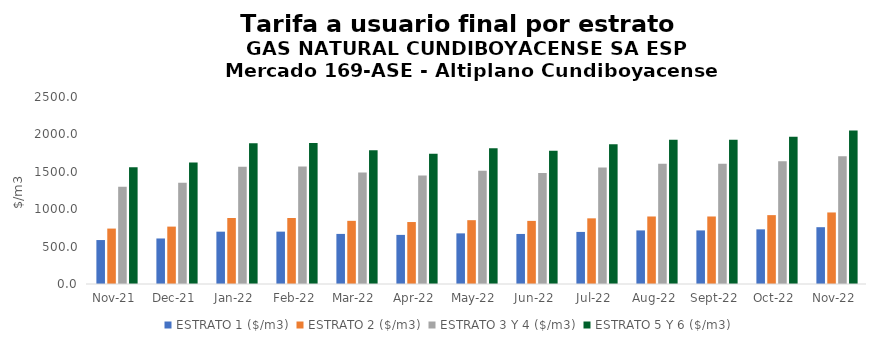
| Category | ESTRATO 1 ($/m3) | ESTRATO 2 ($/m3) | ESTRATO 3 Y 4 ($/m3) | ESTRATO 5 Y 6 ($/m3) |
|---|---|---|---|---|
| 2021-11-01 | 587.65 | 740.96 | 1300.64 | 1560.768 |
| 2021-12-01 | 608.59 | 767.28 | 1352.49 | 1622.988 |
| 2022-01-01 | 699.65 | 882.45 | 1569.02 | 1882.824 |
| 2022-02-01 | 700.14 | 882.16 | 1571.65 | 1885.98 |
| 2022-03-01 | 669.61 | 844.39 | 1490.39 | 1788.468 |
| 2022-04-01 | 656.53 | 828.5 | 1451.93 | 1742.316 |
| 2022-05-01 | 676.87 | 853.19 | 1513.35 | 1816.02 |
| 2022-06-01 | 669.11 | 843.76 | 1485.4 | 1782.48 |
| 2022-07-01 | 696.25 | 877.82 | 1556.51 | 1867.812 |
| 2022-08-01 | 716.29 | 902.55 | 1608.02 | 1929.624 |
| 2022-09-01 | 716.29 | 902.55 | 1608.02 | 1929.624 |
| 2022-10-01 | 730.59 | 920.71 | 1640.64 | 1968.768 |
| 2022-11-01 | 759.45 | 956.41 | 1709.23 | 2051.076 |